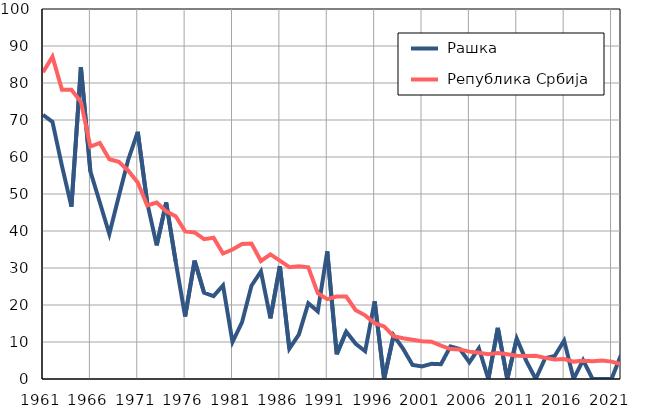
| Category |  Рашка |  Република Србија |
|---|---|---|
| 1961.0 | 71.4 | 82.9 |
| 1962.0 | 69.5 | 87.1 |
| 1963.0 | 57.6 | 78.2 |
| 1964.0 | 46.6 | 78.2 |
| 1965.0 | 84.3 | 74.9 |
| 1966.0 | 56.1 | 62.8 |
| 1967.0 | 47.7 | 63.8 |
| 1968.0 | 39.2 | 59.4 |
| 1969.0 | 49.4 | 58.7 |
| 1970.0 | 59.3 | 56.3 |
| 1971.0 | 66.8 | 53.1 |
| 1972.0 | 47.6 | 46.9 |
| 1973.0 | 36.1 | 47.7 |
| 1974.0 | 47.7 | 45.3 |
| 1975.0 | 31.8 | 44 |
| 1976.0 | 16.9 | 39.9 |
| 1977.0 | 32 | 39.6 |
| 1978.0 | 23.3 | 37.8 |
| 1979.0 | 22.4 | 38.2 |
| 1980.0 | 25.3 | 33.9 |
| 1981.0 | 10 | 35 |
| 1982.0 | 15.3 | 36.5 |
| 1983.0 | 25.2 | 36.6 |
| 1984.0 | 29.1 | 31.9 |
| 1985.0 | 16.4 | 33.7 |
| 1986.0 | 30.5 | 32 |
| 1987.0 | 8.2 | 30.2 |
| 1988.0 | 12 | 30.5 |
| 1989.0 | 20.5 | 30.2 |
| 1990.0 | 18.3 | 23.2 |
| 1991.0 | 34.5 | 21.6 |
| 1992.0 | 6.7 | 22.3 |
| 1993.0 | 12.8 | 22.3 |
| 1994.0 | 9.5 | 18.6 |
| 1995.0 | 7.5 | 17.2 |
| 1996.0 | 21 | 15.1 |
| 1997.0 | 0 | 14.2 |
| 1998.0 | 11.8 | 11.6 |
| 1999.0 | 8.2 | 11 |
| 2000.0 | 3.8 | 10.6 |
| 2001.0 | 3.4 | 10.2 |
| 2002.0 | 4.1 | 10.1 |
| 2003.0 | 4 | 9 |
| 2004.0 | 8.8 | 8.1 |
| 2005.0 | 8.1 | 8 |
| 2006.0 | 4.5 | 7.4 |
| 2007.0 | 8.3 | 7.1 |
| 2008.0 | 0 | 6.7 |
| 2009.0 | 13.8 | 7 |
| 2010.0 | 0 | 6.7 |
| 2011.0 | 10.9 | 6.3 |
| 2012.0 | 4.9 | 6.2 |
| 2013.0 | 0 | 6.3 |
| 2014.0 | 5.6 | 5.7 |
| 2015.0 | 6.2 | 5.3 |
| 2016.0 | 10.4 | 5.4 |
| 2017.0 | 0 | 4.7 |
| 2018.0 | 5.1 | 4.9 |
| 2019.0 | 0 | 4.8 |
| 2020.0 | 0 | 5 |
| 2021.0 | 0 | 4.7 |
| 2022.0 | 6.5 | 4 |